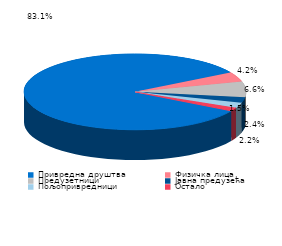
| Category | Series 0 |
|---|---|
| Привредна друштва | 0.831 |
| Физичка лица | 0.042 |
| Предузетници | 0.066 |
| Јавна предузећа | 0.024 |
| Пољопривредници | 0.022 |
| Остало | 0.015 |